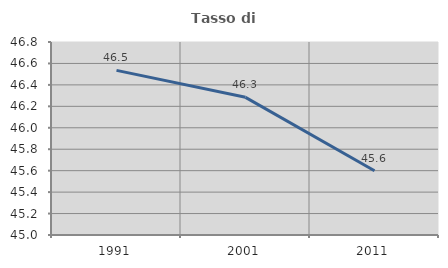
| Category | Tasso di occupazione   |
|---|---|
| 1991.0 | 46.535 |
| 2001.0 | 46.284 |
| 2011.0 | 45.599 |